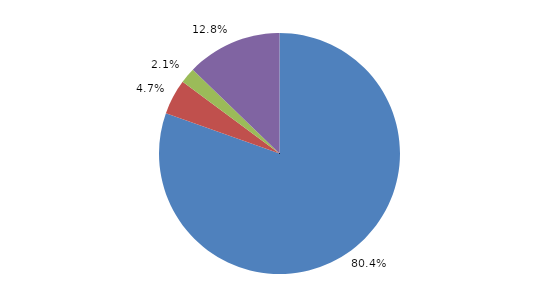
| Category | Series 0 |
|---|---|
| allgemeine Krankheit (einschließlich Impfschaden) | 170957 |
| angeborene Behinderung | 10024 |
| Unfälle1 | 4440 |
| sonstige, mehrere oder ungenügend bezeichnete Ursachen | 27156 |